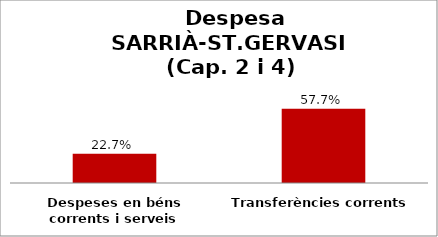
| Category | Series 0 |
|---|---|
| Despeses en béns corrents i serveis | 0.227 |
| Transferències corrents | 0.577 |